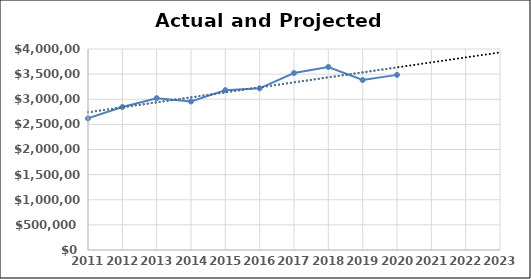
| Category | Series 0 |
|---|---|
| 2011.0 | 2618912 |
| 2012.0 | 2845692 |
| 2013.0 | 3021256 |
| 2014.0 | 2956123 |
| 2015.0 | 3181235 |
| 2016.0 | 3216548 |
| 2017.0 | 3521654 |
| 2018.0 | 3642925 |
| 2019.0 | 3381955 |
| 2020.0 | 3485000 |